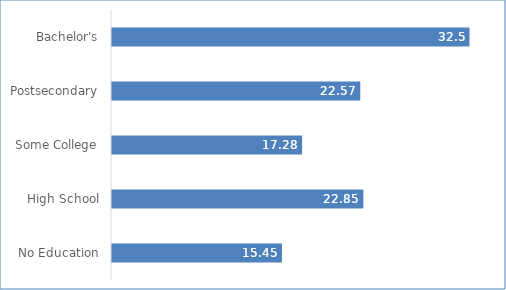
| Category | Series 0 |
|---|---|
| No Education | 15.45 |
| High School | 22.85 |
| Some College | 17.28 |
| Postsecondary | 22.57 |
| Bachelor's | 32.5 |